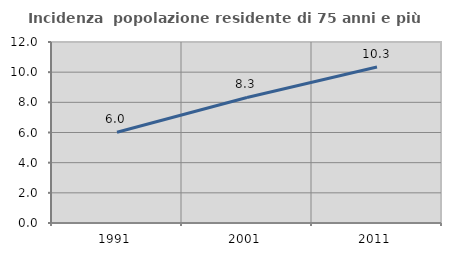
| Category | Incidenza  popolazione residente di 75 anni e più |
|---|---|
| 1991.0 | 6.02 |
| 2001.0 | 8.325 |
| 2011.0 | 10.338 |